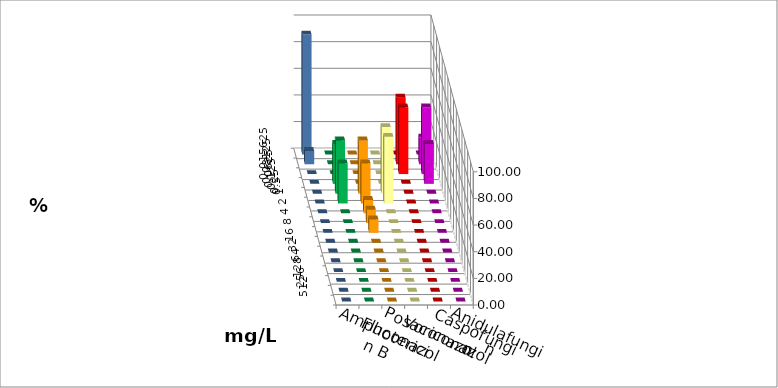
| Category | Amphotericin B | Fluconazol | Posaconazol | Voriconazol | Caspofungin | Anidulafungin |
|---|---|---|---|---|---|---|
| 0.015625 | 0 | 0 | 0 | 0 | 0 | 90 |
| 0.03125 | 0 | 0 | 0 | 50 | 20 | 10 |
| 0.0625 | 0 | 0 | 0 | 50 | 50 | 0 |
| 0.125 | 30 | 0 | 0 | 0 | 30 | 0 |
| 0.25 | 40 | 40 | 50 | 0 | 0 | 0 |
| 0.5 | 30 | 30 | 50 | 0 | 0 | 0 |
| 1.0 | 0 | 10 | 0 | 0 | 0 | 0 |
| 2.0 | 0 | 10 | 0 | 0 | 0 | 0 |
| 4.0 | 0 | 10 | 0 | 0 | 0 | 0 |
| 8.0 | 0 | 0 | 0 | 0 | 0 | 0 |
| 16.0 | 0 | 0 | 0 | 0 | 0 | 0 |
| 32.0 | 0 | 0 | 0 | 0 | 0 | 0 |
| 64.0 | 0 | 0 | 0 | 0 | 0 | 0 |
| 128.0 | 0 | 0 | 0 | 0 | 0 | 0 |
| 256.0 | 0 | 0 | 0 | 0 | 0 | 0 |
| 512.0 | 0 | 0 | 0 | 0 | 0 | 0 |